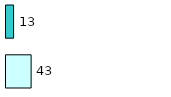
| Category | Series 0 | Series 1 |
|---|---|---|
| 0 | 43 | 13 |